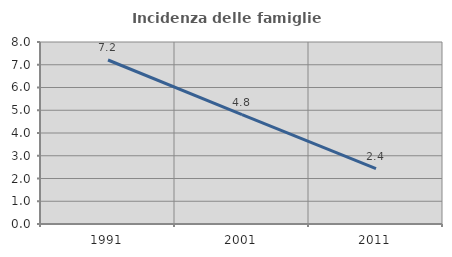
| Category | Incidenza delle famiglie numerose |
|---|---|
| 1991.0 | 7.208 |
| 2001.0 | 4.805 |
| 2011.0 | 2.436 |